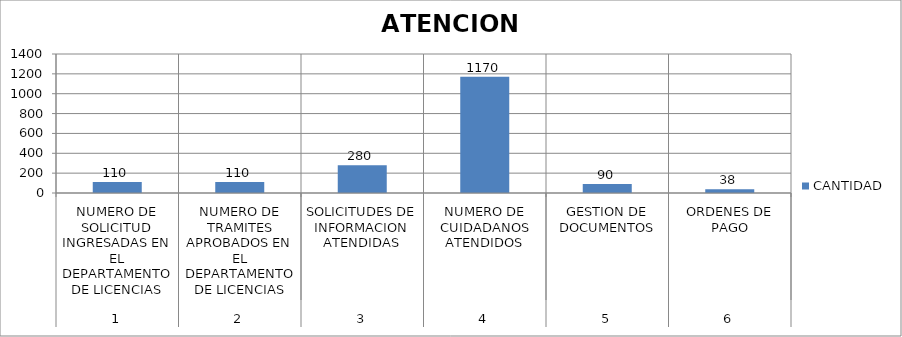
| Category | CANTIDAD |
|---|---|
| 0 | 110 |
| 1 | 110 |
| 2 | 280 |
| 3 | 1170 |
| 4 | 90 |
| 5 | 38 |